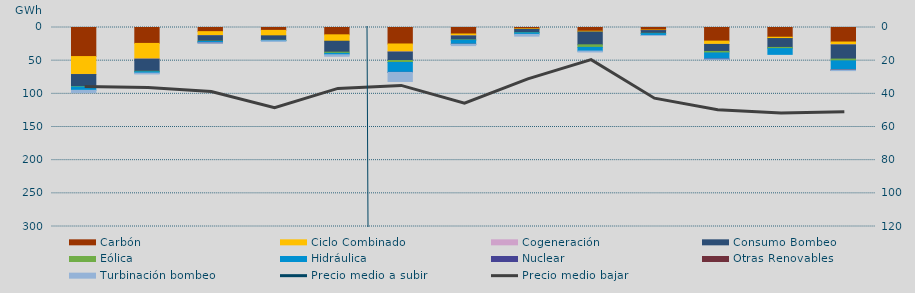
| Category | Carbón | Ciclo Combinado | Cogeneración | Consumo Bombeo | Eólica | Hidráulica | Nuclear | Otras Renovables | Turbinación bombeo |
|---|---|---|---|---|---|---|---|---|---|
| 0 | 43819.1 | 26947.4 | 131.4 | 18038.2 | 700.3 | 5037 | 0 | 0 | 3400 |
| 1 | 23995.8 | 23603.4 | 120.4 | 18312.9 | 630.7 | 2095.3 | 0 | 0 | 1288.4 |
| 2 | 6238.1 | 6107.2 | 11.4 | 8233.1 | 466.1 | 1774.5 | 300.5 | 0 | 185 |
| 3 | 4345.4 | 8205.3 | 0 | 6736.7 | 204.5 | 506 | 0 | 0 | 802.1 |
| 4 | 11031.5 | 9660.7 | 0 | 16502.5 | 1775.9 | 2151.2 | 0 | 0 | 2234.6 |
| 5 | 24843.5 | 12025 | 139.2 | 12696.1 | 3036.8 | 14862.1 | 109.8 | 0 | 13649 |
| 6 | 9788.3 | 2896.9 | 13 | 5978.6 | 470.2 | 6144.5 | 0 | 2 | 2006.5 |
| 7 | 1915.7 | 883.7 | 0 | 4789.3 | 395.2 | 2417.8 | 0 | 0 | 2598.3 |
| 8 | 5601.6 | 1130.8 | 0 | 19369.2 | 3910.4 | 5534.9 | 0 | 0 | 1362.4 |
| 9 | 3825.2 | 805.7 | 1 | 4108.2 | 441.1 | 2792 | 0 | 0 | 67.3 |
| 10 | 20542.2 | 4950.3 | 40.5 | 10583.3 | 2263.7 | 9147 | 197.5 | 0 | 285 |
| 11 | 14664.7 | 1989 | 0 | 13423.2 | 1723.5 | 8686.8 | 0 | 0 | 0 |
| 12 | 21887.7 | 4264.5 | 79.6 | 21354.7 | 2677.3 | 13814.3 | 70 | 3 | 823.8 |